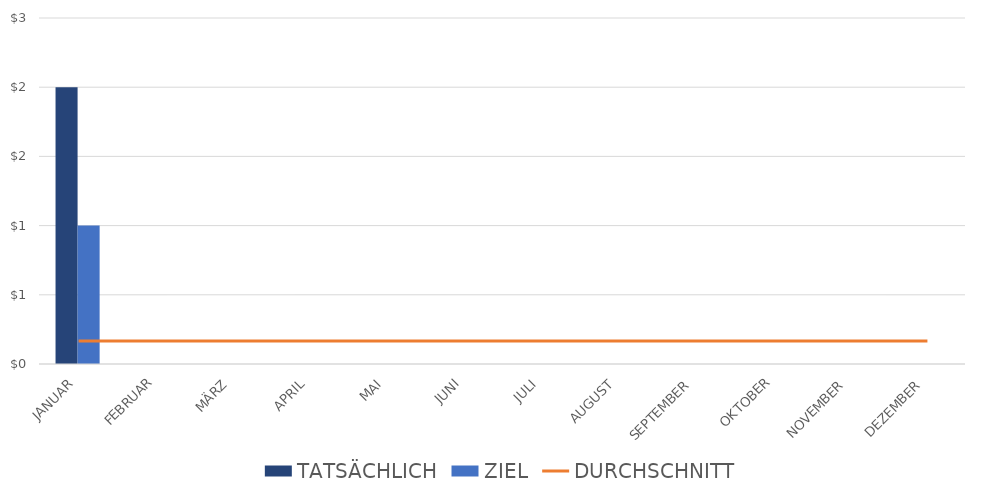
| Category | TATSÄCHLICH | ZIEL |
|---|---|---|
| JANUAR | 2 | 1 |
| FEBRUAR | 0 | 0 |
| MÄRZ | 0 | 0 |
| APRIL | 0 | 0 |
| MAI | 0 | 0 |
| JUNI | 0 | 0 |
| JULI | 0 | 0 |
| AUGUST | 0 | 0 |
| SEPTEMBER | 0 | 0 |
| OKTOBER | 0 | 0 |
| NOVEMBER | 0 | 0 |
| DEZEMBER | 0 | 0 |